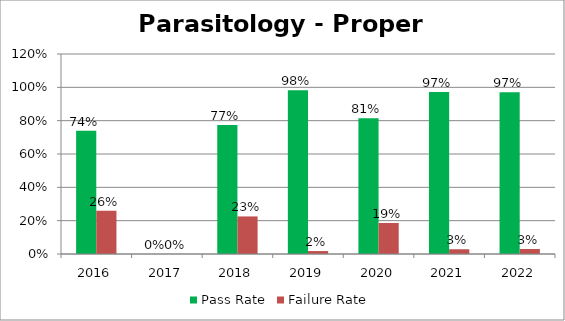
| Category | Pass Rate | Failure Rate |
|---|---|---|
| 2016.0 | 0.74 | 0.26 |
| 2017.0 | 0 | 0 |
| 2018.0 | 0.775 | 0.225 |
| 2019.0 | 0.982 | 0.018 |
| 2020.0 | 0.814 | 0.186 |
| 2021.0 | 0.971 | 0.029 |
| 2022.0 | 0.97 | 0.03 |